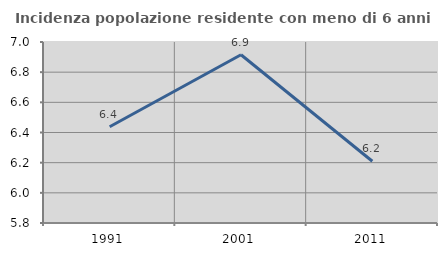
| Category | Incidenza popolazione residente con meno di 6 anni |
|---|---|
| 1991.0 | 6.438 |
| 2001.0 | 6.915 |
| 2011.0 | 6.21 |